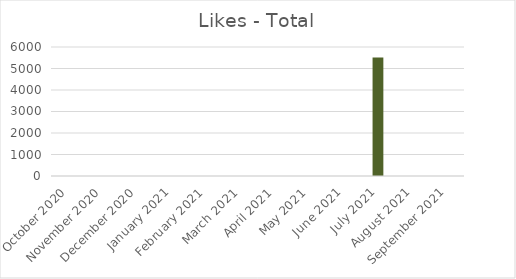
| Category | Total |
|---|---|
| October 2020 | 0 |
| November 2020 | 0 |
| December 2020 | 0 |
| January 2021 | 0 |
| February 2021 | 0 |
| March 2021 | 0 |
| April 2021 | 0 |
| May 2021 | 0 |
| June 2021 | 0 |
| July 2021 | 5511 |
| August 2021 | 0 |
| September 2021 | 0 |